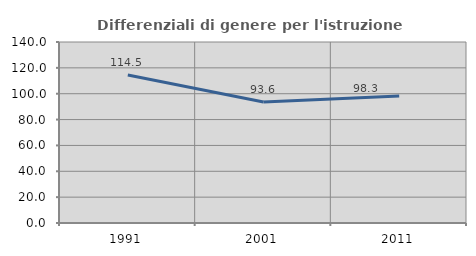
| Category | Differenziali di genere per l'istruzione superiore |
|---|---|
| 1991.0 | 114.514 |
| 2001.0 | 93.606 |
| 2011.0 | 98.325 |